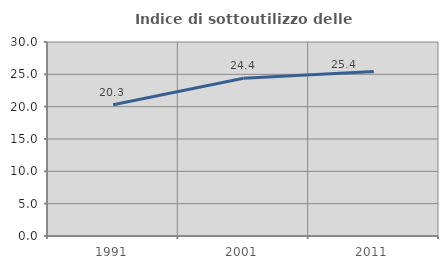
| Category | Indice di sottoutilizzo delle abitazioni  |
|---|---|
| 1991.0 | 20.293 |
| 2001.0 | 24.383 |
| 2011.0 | 25.422 |